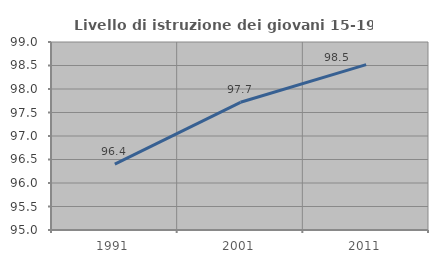
| Category | Livello di istruzione dei giovani 15-19 anni |
|---|---|
| 1991.0 | 96.403 |
| 2001.0 | 97.717 |
| 2011.0 | 98.519 |